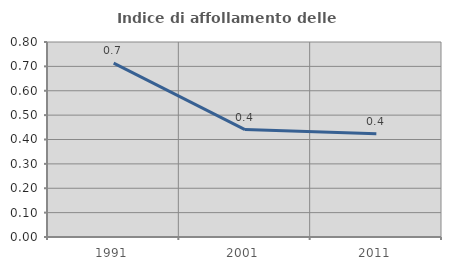
| Category | Indice di affollamento delle abitazioni  |
|---|---|
| 1991.0 | 0.713 |
| 2001.0 | 0.441 |
| 2011.0 | 0.424 |